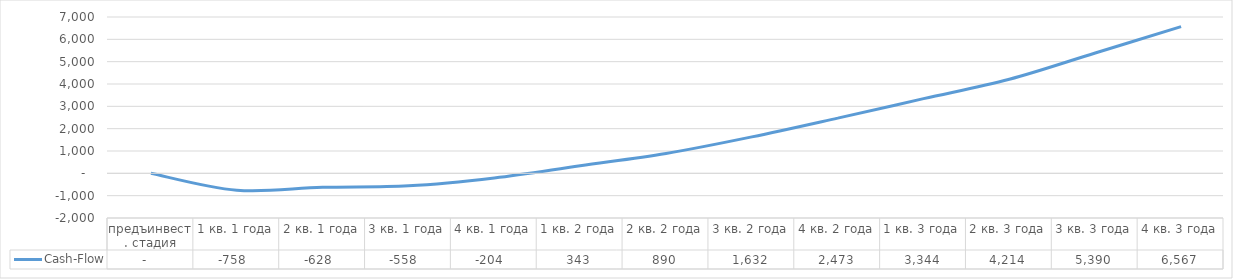
| Category | Cash-Flow |
|---|---|
| предъинвест. стадия | 0 |
| 1 кв. 1 года | -758.222 |
| 2 кв. 1 года | -628.441 |
| 3 кв. 1 года | -557.651 |
| 4 кв. 1 года | -204.26 |
| 1 кв. 2 года | 342.622 |
| 2 кв. 2 года | 889.505 |
| 3 кв. 2 года | 1632.324 |
| 4 кв. 2 года | 2473.111 |
| 1 кв. 3 года | 3343.67 |
| 2 кв. 3 года | 4214.229 |
| 3 кв. 3 года | 5390.448 |
| 4 кв. 3 года | 6566.668 |